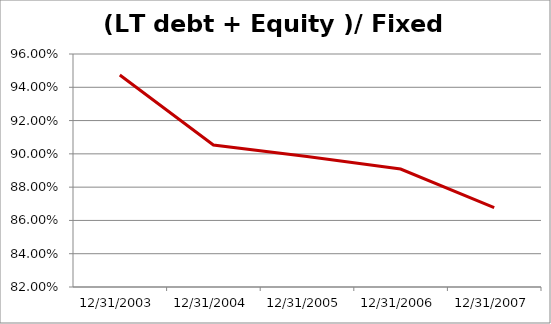
| Category | Solidity |
|---|---|
| 31/12/2003 | 0.947 |
| 31/12/2004 | 0.905 |
| 31/12/2005 | 0.898 |
| 31/12/2006 | 0.891 |
| 31/12/2007 | 0.868 |